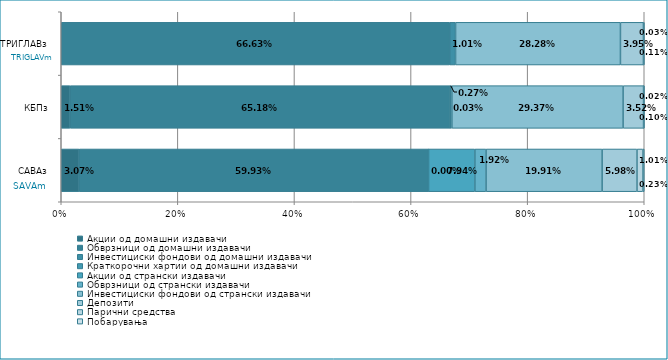
| Category | Акции од домашни издавачи  | Обврзници од домашни издавачи  | Инвестициски фондови од домашни издавачи  | Краткорочни хартии од домашни издавачи  | Акции од странски издавачи  | Обврзници од странски издавачи  | Инвестициски фондови од странски издавaчи | Депозити  | Парични средства  | Побарувања |
|---|---|---|---|---|---|---|---|---|---|---|
| САВАз | 0.031 | 0.599 | 0 | 0 | 0.079 | 0.019 | 0.199 | 0.06 | 0.01 | 0.002 |
| КБПз | 0.015 | 0.652 | 0 | 0 | 0 | 0.003 | 0.294 | 0.035 | 0 | 0.001 |
| ТРИГЛАВз | 0 | 0.666 | 0.01 | 0 | 0 | 0 | 0.283 | 0.039 | 0 | 0.001 |